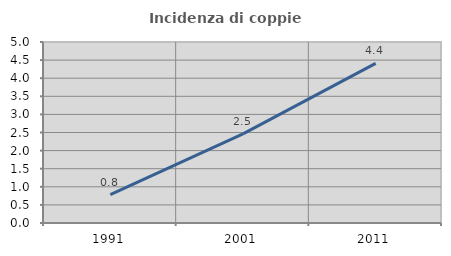
| Category | Incidenza di coppie miste |
|---|---|
| 1991.0 | 0.783 |
| 2001.0 | 2.461 |
| 2011.0 | 4.41 |